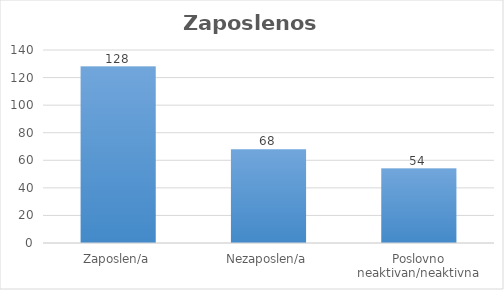
| Category | Zaposlenost |
|---|---|
| Zaposlen/a | 128 |
| Nezaposlen/a | 68 |
| Poslovno neaktivan/neaktivna | 54 |